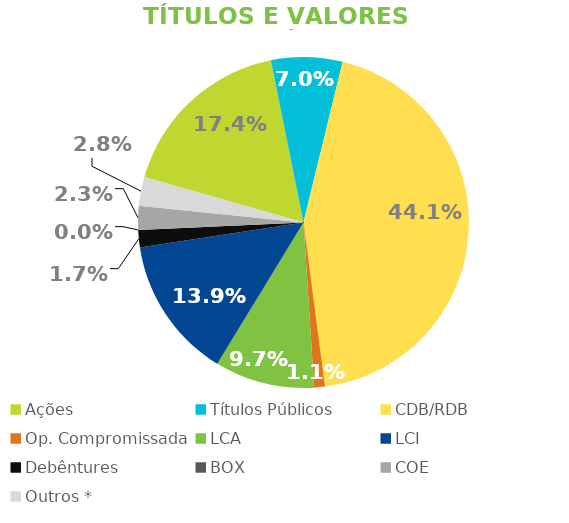
| Category | TVM |
|---|---|
| Ações | 0.174 |
| Títulos Públicos | 0.07 |
| CDB/RDB | 0.441 |
| Op. Compromissada | 0.011 |
| LCA | 0.097 |
| LCI | 0.139 |
| Debêntures | 0.017 |
| BOX | 0 |
| COE | 0.023 |
| Outros * | 0.028 |